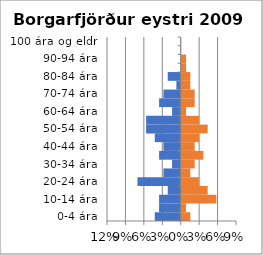
| Category | % karlar | %konur |
|---|---|---|
| 0-4 ára | -0.042 | 0.014 |
| 5-9 ára | -0.035 | 0.007 |
| 10-14 ára | -0.035 | 0.056 |
| 15-19 ára | -0.021 | 0.042 |
| 20-24 ára | -0.07 | 0.028 |
| 25-29 ára | -0.028 | 0.014 |
| 30-34 ára | -0.014 | 0.021 |
| 35-39 ára | -0.035 | 0.035 |
| 40-44 ára | -0.028 | 0.021 |
| 45-49 ára | -0.042 | 0.028 |
| 50-54 ára | -0.056 | 0.042 |
| 55-59 ára | -0.056 | 0.028 |
| 60-64 ára | -0.014 | 0.007 |
| 65-69 ára | -0.035 | 0.021 |
| 70-74 ára | -0.028 | 0.021 |
| 75-79 ára | -0.007 | 0.014 |
| 80-84 ára | -0.021 | 0.014 |
| 85-89 ára | 0 | 0.007 |
| 90-94 ára | 0 | 0.007 |
| 95-99 ára | 0 | 0 |
| 100 ára og eldri | 0 | 0 |